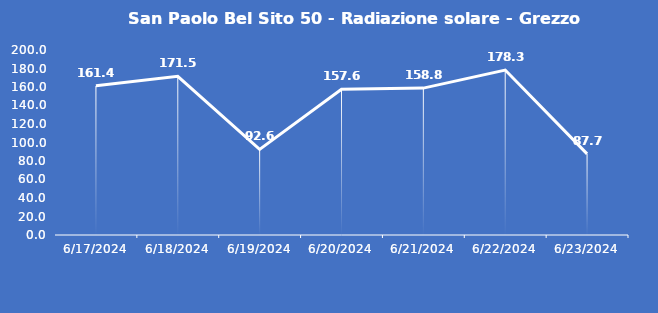
| Category | San Paolo Bel Sito 50 - Radiazione solare - Grezzo (W/m2) |
|---|---|
| 6/17/24 | 161.4 |
| 6/18/24 | 171.5 |
| 6/19/24 | 92.6 |
| 6/20/24 | 157.6 |
| 6/21/24 | 158.8 |
| 6/22/24 | 178.3 |
| 6/23/24 | 87.7 |